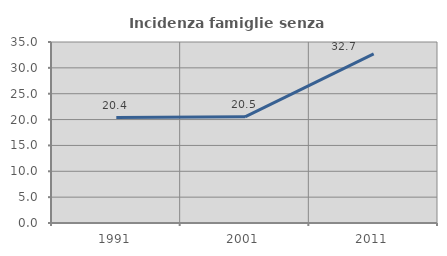
| Category | Incidenza famiglie senza nuclei |
|---|---|
| 1991.0 | 20.393 |
| 2001.0 | 20.522 |
| 2011.0 | 32.707 |